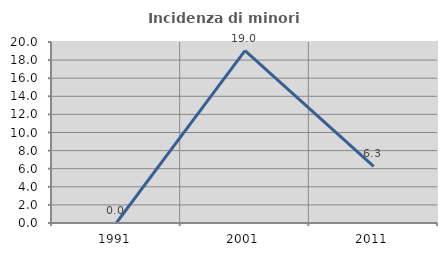
| Category | Incidenza di minori stranieri |
|---|---|
| 1991.0 | 0 |
| 2001.0 | 19.048 |
| 2011.0 | 6.25 |